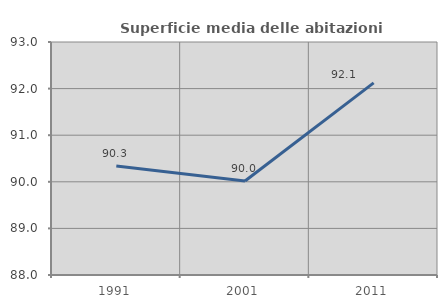
| Category | Superficie media delle abitazioni occupate |
|---|---|
| 1991.0 | 90.341 |
| 2001.0 | 90.018 |
| 2011.0 | 92.123 |